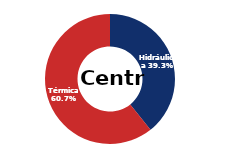
| Category | Centro |
|---|---|
| Eólica | 0 |
| Hidráulica | 1516.095 |
| Solar | 0.006 |
| Térmica | 2341.965 |